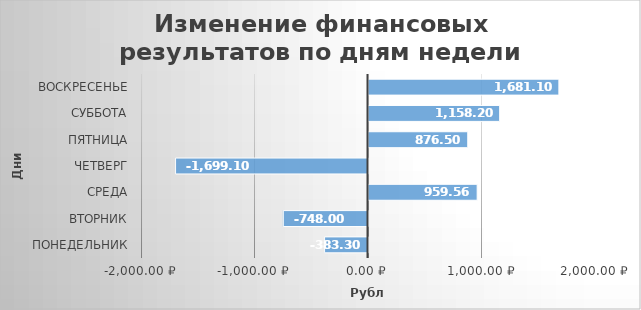
| Category | Series 0 |
|---|---|
| понедельник | -383.3 |
| вторник | -748 |
| среда | 959.56 |
| четверг | -1699.1 |
| пятница | 876.5 |
| суббота | 1158.2 |
| воскресенье | 1681.1 |